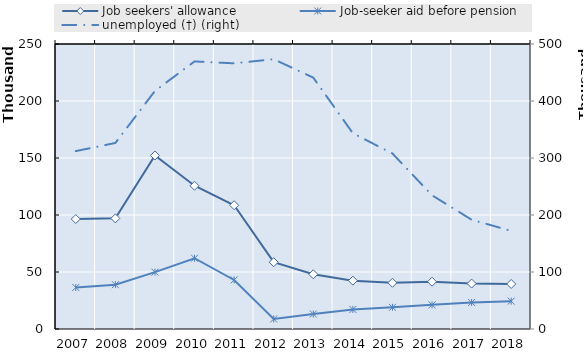
| Category | Series 5 | Series 6 | Series 7 | Series 8 | Series 9 | Series 10 | Series 11 | Series 12 | Series 13 | Series 14 | Series 15 | Series 16 | Series 17 | Series 18 | Series 19 | Job seekers' allowance | Job-seeker aid before pension |
|---|---|---|---|---|---|---|---|---|---|---|---|---|---|---|---|---|---|
| 2007.0 |  |  |  |  |  |  |  |  |  |  |  |  |  |  |  | 96462.667 | 36415 |
| 2008.0 |  |  |  |  |  |  |  |  |  |  |  |  |  |  |  | 97046.583 | 38890.583 |
| 2009.0 |  |  |  |  |  |  |  |  |  |  |  |  |  |  |  | 152197 | 49878 |
| 2010.0 |  |  |  |  |  |  |  |  |  |  |  |  |  |  |  | 125651 | 62082 |
| 2011.0 |  |  |  |  |  |  |  |  |  |  |  |  |  |  |  | 108568 | 43027 |
| 2012.0 |  |  |  |  |  |  |  |  |  |  |  |  |  |  |  | 58601 | 8776 |
| 2013.0 |  |  |  |  |  |  |  |  |  |  |  |  |  |  |  | 47997.833 | 13152.25 |
| 2014.0 |  |  |  |  |  |  |  |  |  |  |  |  |  |  |  | 42402 | 17141.583 |
| 2015.0 |  |  |  |  |  |  |  |  |  |  |  |  |  |  |  | 40556 | 19006 |
| 2016.0 |  |  |  |  |  |  |  |  |  |  |  |  |  |  |  | 41501 | 21185 |
| 2017.0 |  |  |  |  |  |  |  |  |  |  |  |  |  |  |  | 39862 | 23258 |
| 2018.0 |  |  |  |  |  |  |  |  |  |  |  |  |  |  |  | 39512 | 24439 |